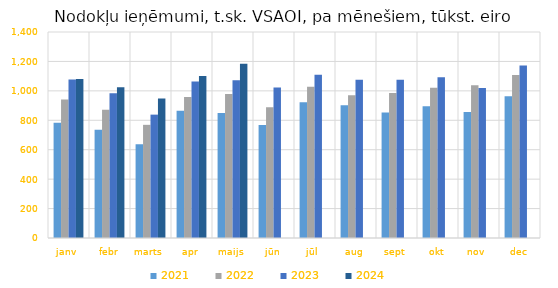
| Category | 2021 | 2022 | 2023 | 2024 |
|---|---|---|---|---|
| janv | 782986.001 | 941791.936 | 1077162.761 | 1080454.102 |
| febr | 734852.065 | 870814.989 | 983504.244 | 1024283.855 |
| marts | 637891.51 | 769054.685 | 838446.19 | 948366.56 |
| apr | 864350.424 | 957835.152 | 1063867.001 | 1101148.3 |
| maijs | 850252.991 | 978678.559 | 1071795.241 | 1184611.626 |
| jūn | 768738.388 | 888916.233 | 1023214.676 | 0 |
| jūl | 922262.256 | 1027456.888 | 1108668.131 | 0 |
| aug | 901674.184 | 969994.081 | 1074853.308 | 0 |
| sept | 852725.586 | 985435.904 | 1074818.769 | 0 |
| okt | 895873.595 | 1021662.514 | 1092402.095 | 0 |
| nov | 856461.1 | 1038227.674 | 1019073.949 | 0 |
| dec | 962936.043 | 1107409.079 | 1172609.23 | 0 |